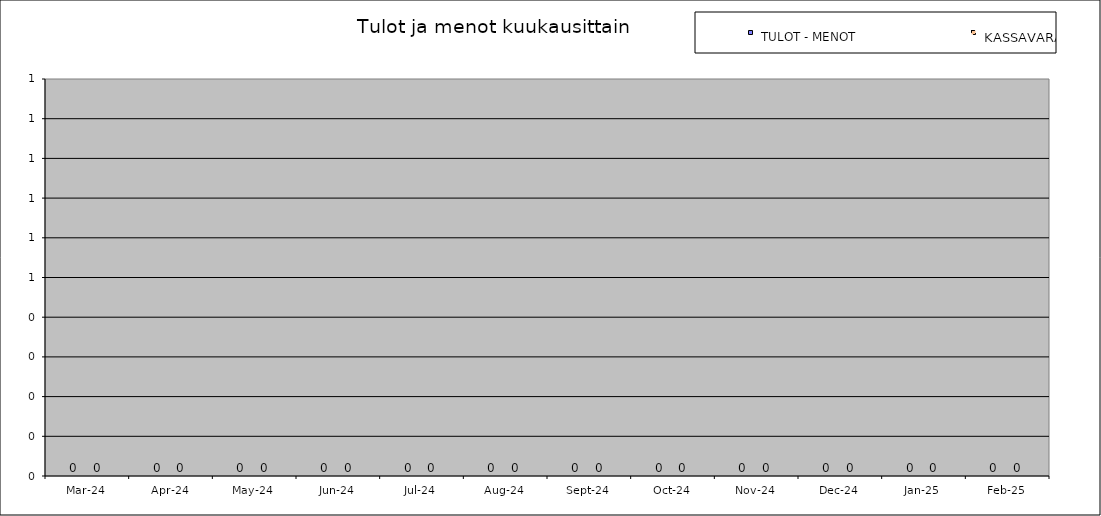
| Category |  TULOT - MENOT |  KASSAVARAT KAUDEN LOPUSSA |
|---|---|---|
| 2024-03-01 | 0 | 0 |
| 2024-04-01 | 0 | 0 |
| 2024-05-02 | 0 | 0 |
| 2024-06-02 | 0 | 0 |
| 2024-07-03 | 0 | 0 |
| 2024-08-03 | 0 | 0 |
| 2024-09-03 | 0 | 0 |
| 2024-10-04 | 0 | 0 |
| 2024-11-04 | 0 | 0 |
| 2024-12-05 | 0 | 0 |
| 2025-01-05 | 0 | 0 |
| 2025-02-05 | 0 | 0 |